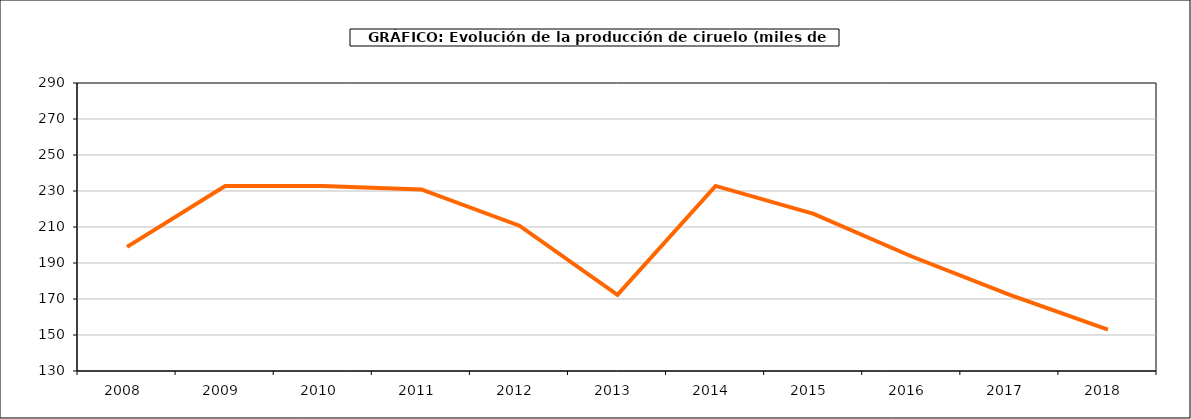
| Category | producción Ciruelo |
|---|---|
| 2008.0 | 198.948 |
| 2009.0 | 232.78 |
| 2010.0 | 232.78 |
| 2011.0 | 230.877 |
| 2012.0 | 210.726 |
| 2013.0 | 172.352 |
| 2014.0 | 232.831 |
| 2015.0 | 217.291 |
| 2016.0 | 193.598 |
| 2017.0 | 172.325 |
| 2018.0 | 152.984 |